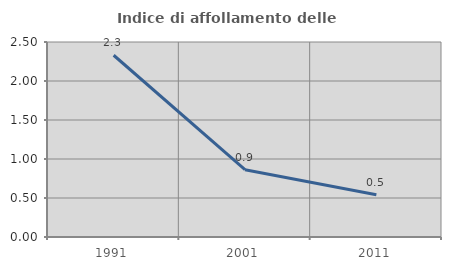
| Category | Indice di affollamento delle abitazioni  |
|---|---|
| 1991.0 | 2.33 |
| 2001.0 | 0.863 |
| 2011.0 | 0.543 |